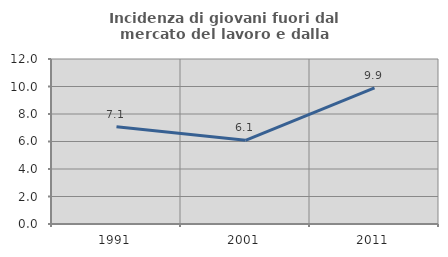
| Category | Incidenza di giovani fuori dal mercato del lavoro e dalla formazione  |
|---|---|
| 1991.0 | 7.069 |
| 2001.0 | 6.083 |
| 2011.0 | 9.901 |